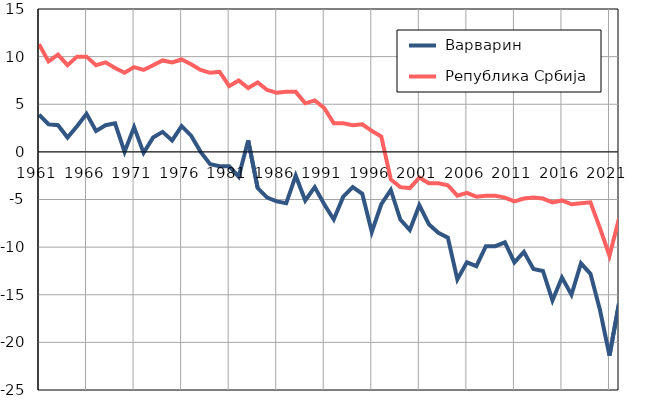
| Category |  Варварин |  Република Србија |
|---|---|---|
| 1961.0 | 3.9 | 11.3 |
| 1962.0 | 2.9 | 9.5 |
| 1963.0 | 2.8 | 10.2 |
| 1964.0 | 1.5 | 9.1 |
| 1965.0 | 2.7 | 10 |
| 1966.0 | 4 | 10 |
| 1967.0 | 2.2 | 9.1 |
| 1968.0 | 2.8 | 9.4 |
| 1969.0 | 3 | 8.8 |
| 1970.0 | 0 | 8.3 |
| 1971.0 | 2.6 | 8.9 |
| 1972.0 | -0.1 | 8.6 |
| 1973.0 | 1.5 | 9.1 |
| 1974.0 | 2.1 | 9.6 |
| 1975.0 | 1.2 | 9.4 |
| 1976.0 | 2.7 | 9.7 |
| 1977.0 | 1.7 | 9.2 |
| 1978.0 | 0 | 8.6 |
| 1979.0 | -1.3 | 8.3 |
| 1980.0 | -1.5 | 8.4 |
| 1981.0 | -1.5 | 6.9 |
| 1982.0 | -2.6 | 7.5 |
| 1983.0 | 1.2 | 6.7 |
| 1984.0 | -3.8 | 7.3 |
| 1985.0 | -4.8 | 6.5 |
| 1986.0 | -5.2 | 6.2 |
| 1987.0 | -5.4 | 6.3 |
| 1988.0 | -2.5 | 6.3 |
| 1989.0 | -5.1 | 5.1 |
| 1990.0 | -3.7 | 5.4 |
| 1991.0 | -5.5 | 4.6 |
| 1992.0 | -7.1 | 3 |
| 1993.0 | -4.7 | 3 |
| 1994.0 | -3.7 | 2.8 |
| 1995.0 | -4.4 | 2.9 |
| 1996.0 | -8.4 | 2.2 |
| 1997.0 | -5.5 | 1.6 |
| 1998.0 | -4 | -2.9 |
| 1999.0 | -7.1 | -3.7 |
| 2000.0 | -8.2 | -3.8 |
| 2001.0 | -5.6 | -2.7 |
| 2002.0 | -7.6 | -3.3 |
| 2003.0 | -8.5 | -3.3 |
| 2004.0 | -9 | -3.5 |
| 2005.0 | -13.4 | -4.6 |
| 2006.0 | -11.6 | -4.3 |
| 2007.0 | -12 | -4.7 |
| 2008.0 | -9.9 | -4.6 |
| 2009.0 | -9.9 | -4.6 |
| 2010.0 | -9.5 | -4.8 |
| 2011.0 | -11.6 | -5.2 |
| 2012.0 | -10.5 | -4.9 |
| 2013.0 | -12.3 | -4.8 |
| 2014.0 | -12.5 | -4.9 |
| 2015.0 | -15.6 | -5.3 |
| 2016.0 | -13.2 | -5.1 |
| 2017.0 | -15 | -5.5 |
| 2018.0 | -11.7 | -5.4 |
| 2019.0 | -12.8 | -5.3 |
| 2020.0 | -16.6 | -8 |
| 2021.0 | -21.4 | -10.9 |
| 2022.0 | -15.9 | -7 |